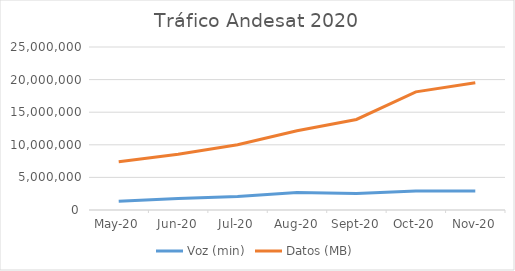
| Category | Voz (min) | Datos (MB) |
|---|---|---|
| 2020-05-01 | 1356567.85 | 7406475.433 |
| 2020-06-01 | 1748828.183 | 8567279.389 |
| 2020-07-01 | 2078229.683 | 10006465.433 |
| 2020-08-01 | 2689690.183 | 12144233.917 |
| 2020-09-01 | 2512746.417 | 13883708.436 |
| 2020-10-01 | 2907867.6 | 18120540.541 |
| 2020-11-01 | 2925293.283 | 19532032.215 |